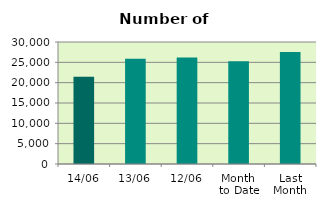
| Category | Series 0 |
|---|---|
| 14/06 | 21470 |
| 13/06 | 25860 |
| 12/06 | 26216 |
| Month 
to Date | 25255.6 |
| Last
Month | 27522.455 |